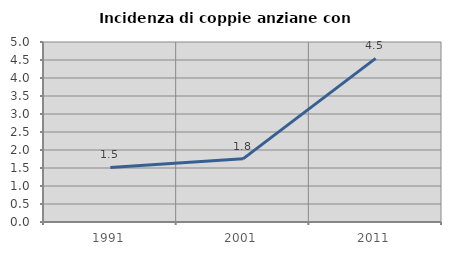
| Category | Incidenza di coppie anziane con figli |
|---|---|
| 1991.0 | 1.515 |
| 2001.0 | 1.754 |
| 2011.0 | 4.545 |